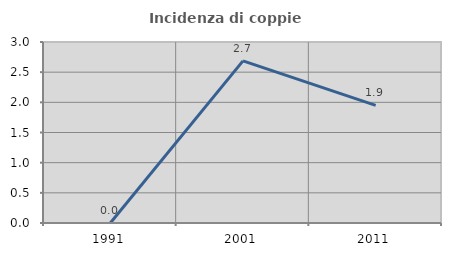
| Category | Incidenza di coppie miste |
|---|---|
| 1991.0 | 0 |
| 2001.0 | 2.687 |
| 2011.0 | 1.95 |